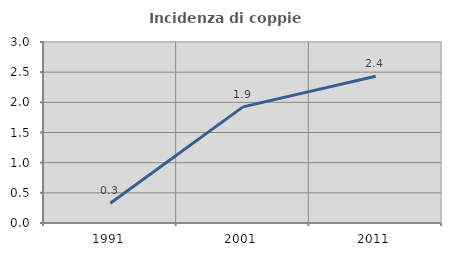
| Category | Incidenza di coppie miste |
|---|---|
| 1991.0 | 0.329 |
| 2001.0 | 1.924 |
| 2011.0 | 2.432 |